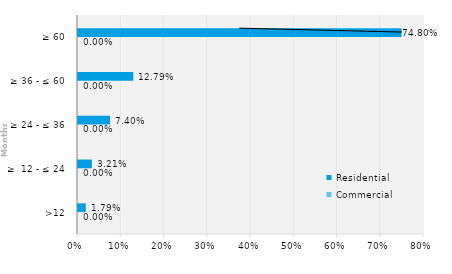
| Category | Commercial | Residential |
|---|---|---|
| >12 | 0 | 0.018 |
| ≥  12 - ≤ 24 | 0 | 0.032 |
| ≥ 24 - ≤ 36 | 0 | 0.074 |
| ≥ 36 - ≤ 60 | 0 | 0.128 |
| ≥ 60 | 0 | 0.748 |